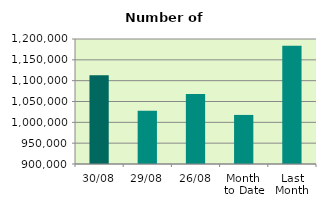
| Category | Series 0 |
|---|---|
| 30/08 | 1112966 |
| 29/08 | 1027916 |
| 26/08 | 1068030 |
| Month 
to Date | 1017761.727 |
| Last
Month | 1183989.81 |